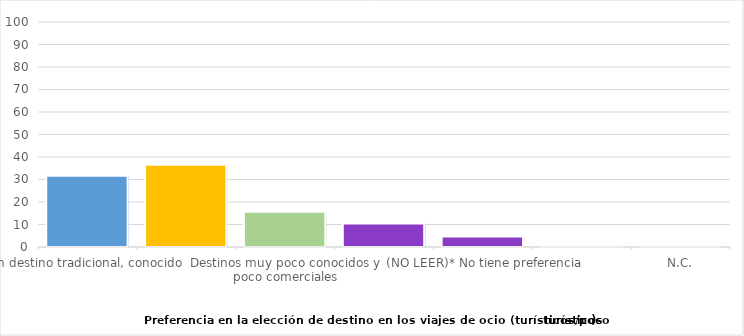
| Category | Series 0 |
|---|---|
| Un destino tradicional, conocido | 31.7 |
| Nuevos destinos turísticos, menos conocidos | 36.6 |
| Destinos muy poco conocidos y poco comerciales | 15.7 |
| (NO LEER)* Depende, cualquiera de ellos | 10.5 |
| (NO LEER)* No tiene preferencia | 4.7 |
| N.S. | 0.4 |
| N.C. | 0.3 |